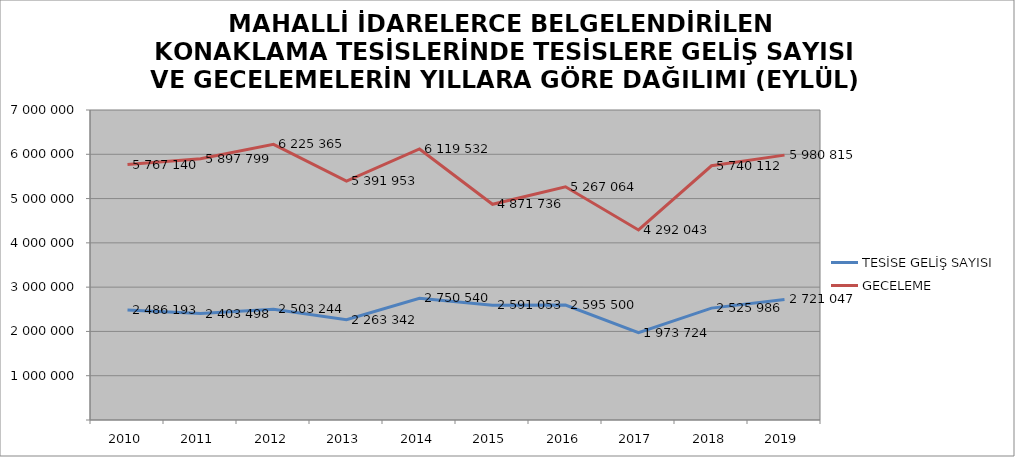
| Category | TESİSE GELİŞ SAYISI | GECELEME |
|---|---|---|
| 2010 | 2486193 | 5767140 |
| 2011 | 2403498 | 5897799 |
| 2012 | 2503244 | 6225365 |
| 2013 | 2263342 | 5391953 |
| 2014 | 2750540 | 6119532 |
| 2015 | 2591053 | 4871736 |
| 2016 | 2595500 | 5267064 |
| 2017 | 1973724 | 4292043 |
| 2018 | 2525986 | 5740112 |
| 2019 | 2721047 | 5980815 |